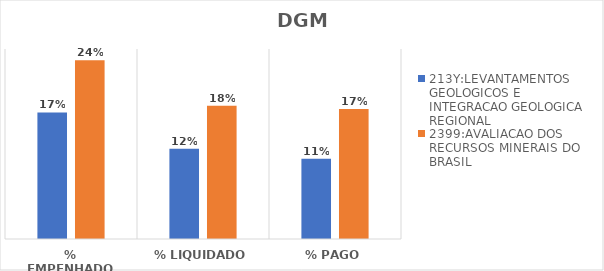
| Category | 213Y:LEVANTAMENTOS GEOLOGICOS E INTEGRACAO GEOLOGICA REGIONAL | 2399:AVALIACAO DOS RECURSOS MINERAIS DO BRASIL |
|---|---|---|
| % EMPENHADO | 0.167 | 0.235 |
| % LIQUIDADO | 0.119 | 0.175 |
| % PAGO | 0.106 | 0.171 |